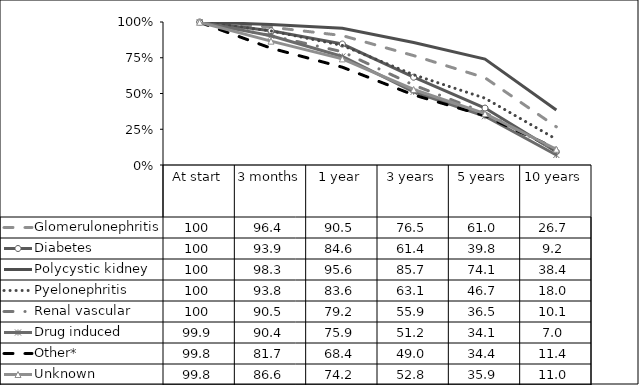
| Category | Glomerulonephritis | Diabetes | Polycystic kidney | Pyelonephritis | Renal vascular | Drug induced | Other* | Unknown |
|---|---|---|---|---|---|---|---|---|
| At start | 100 | 100 | 100 | 100 | 100 | 99.9 | 99.8 | 99.8 |
| 3 months | 96.4 | 93.9 | 98.3 | 93.8 | 90.5 | 90.4 | 81.7 | 86.6 |
| 1 year | 90.5 | 84.6 | 95.6 | 83.6 | 79.2 | 75.9 | 68.4 | 74.2 |
| 3 years | 76.5 | 61.4 | 85.7 | 63.1 | 55.9 | 51.2 | 49 | 52.8 |
| 5 years | 61 | 39.8 | 74.1 | 46.7 | 36.5 | 34.1 | 34.4 | 35.9 |
| 10 years | 26.7 | 9.2 | 38.4 | 18 | 10.1 | 7 | 11.4 | 11 |